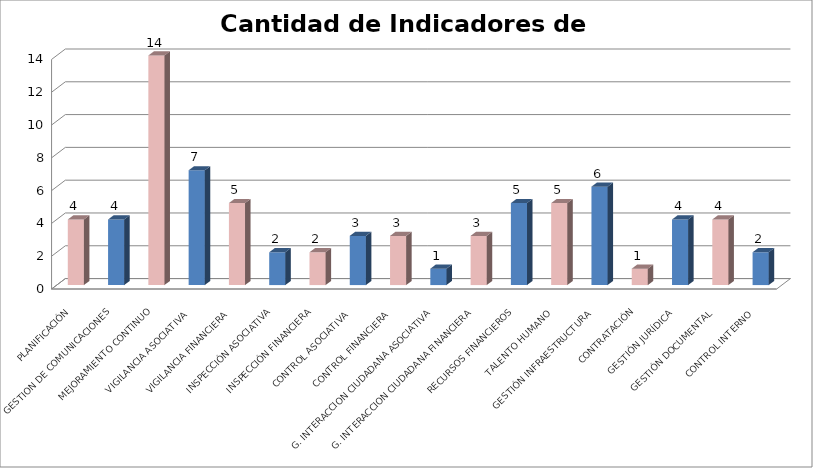
| Category | Series 0 |
|---|---|
| PLANIFICACIÓN | 4 |
| GESTION DE COMUNICACIONES | 4 |
| MEJORAMIENTO CONTINUO | 14 |
| VIGILANCIA ASOCIATIVA | 7 |
| VIGILANCIA FINANCIERA | 5 |
| INSPECCIÓN ASOCIATIVA | 2 |
| INSPECCIÓN FINANCIERA | 2 |
| CONTROL ASOCIATIVA | 3 |
| CONTROL FINANCIERA | 3 |
| G. INTERACCION CIUDADANA ASOCIATIVA | 1 |
| G. INTERACCION CIUDADANA FINANCIERA | 3 |
| RECURSOS FINANCIEROS | 5 |
| TALENTO HUMANO | 5 |
| GESTIÓN INFRAESTRUCTURA | 6 |
| CONTRATACIÓN | 1 |
| GESTIÓN JURÍDICA | 4 |
| GESTIÓN DOCUMENTAL | 4 |
| CONTROL INTERNO | 2 |